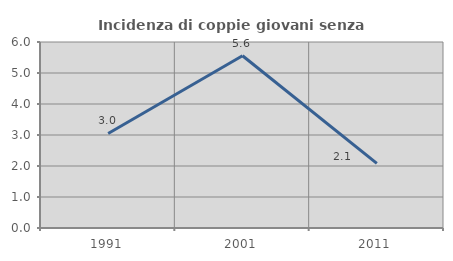
| Category | Incidenza di coppie giovani senza figli |
|---|---|
| 1991.0 | 3.049 |
| 2001.0 | 5.556 |
| 2011.0 | 2.083 |